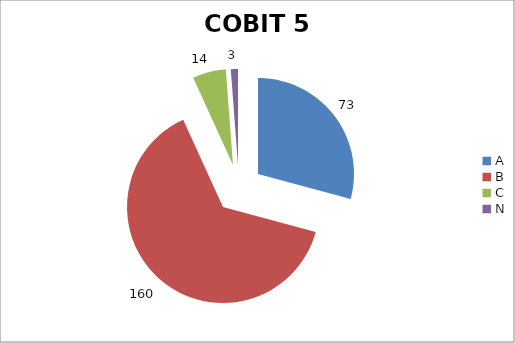
| Category | Series 0 |
|---|---|
| A | 73 |
| B | 160 |
| C | 14 |
| N | 3 |